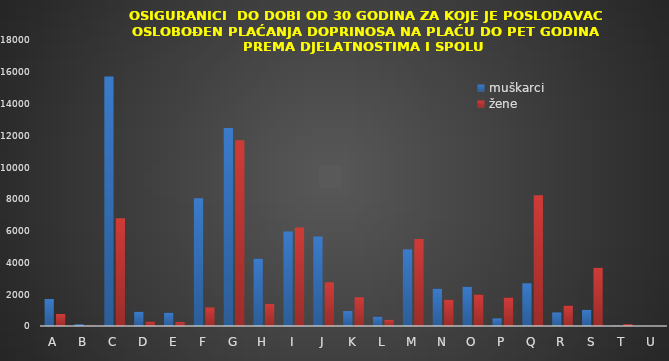
| Category | muškarci | žene |
|---|---|---|
| A | 1699 | 758 |
| B | 112 | 17 |
| C | 15706 | 6783 |
| D | 892 | 279 |
| E | 835 | 253 |
| F | 8041 | 1166 |
| G | 12460 | 11685 |
| H | 4243 | 1389 |
| I | 5952 | 6201 |
| J | 5633 | 2752 |
| K | 941 | 1812 |
| L | 590 | 386 |
| M | 4821 | 5478 |
| N | 2350 | 1652 |
| O | 2467 | 1979 |
| P | 480 | 1792 |
| Q | 2688 | 8227 |
| R | 853 | 1282 |
| S | 1011 | 3662 |
| T | 19 | 113 |
| U | 3 | 5 |